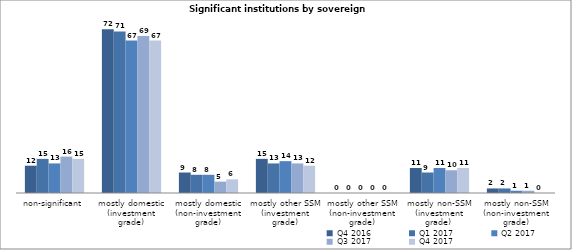
| Category | Q4 2016 | Q1 2017 | Q2 2017 | Q3 2017 | Q4 2017 |
|---|---|---|---|---|---|
| non-significant | 12 | 15 | 13 | 16 | 15 |
| mostly domestic
(investment grade) | 72 | 71 | 67 | 69 | 67 |
| mostly domestic
(non-investment grade) | 9 | 8 | 8 | 5 | 6 |
| mostly other SSM
(investment grade) | 15 | 13 | 14 | 13 | 12 |
| mostly other SSM
(non-investment grade) | 0 | 0 | 0 | 0 | 0 |
| mostly non-SSM
(investment grade)  | 11 | 9 | 11 | 10 | 11 |
| mostly non-SSM
(non-investment grade) | 2 | 2 | 1 | 1 | 0 |